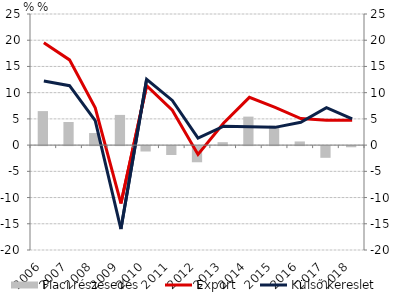
| Category | Piaci részesedés |
|---|---|
| 2006.0 | 6.485 |
| 2007.0 | 4.412 |
| 2008.0 | 2.301 |
| 2009.0 | 5.76 |
| 2010.0 | -1.028 |
| 2011.0 | -1.7 |
| 2012.0 | -3.081 |
| 2013.0 | 0.56 |
| 2014.0 | 5.435 |
| 2015.0 | 3.7 |
| 2016.0 | 0.697 |
| 2017.0 | -2.232 |
| 2018.0 | -0.223 |